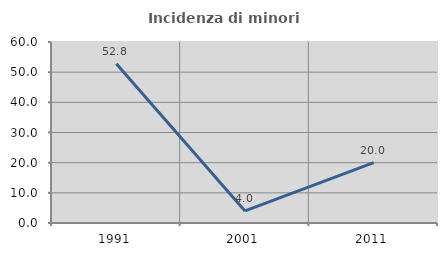
| Category | Incidenza di minori stranieri |
|---|---|
| 1991.0 | 52.778 |
| 2001.0 | 4 |
| 2011.0 | 20 |